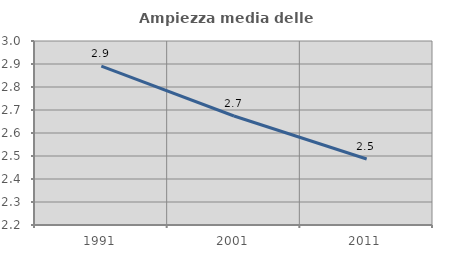
| Category | Ampiezza media delle famiglie |
|---|---|
| 1991.0 | 2.891 |
| 2001.0 | 2.674 |
| 2011.0 | 2.487 |